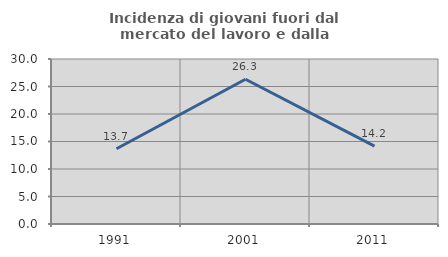
| Category | Incidenza di giovani fuori dal mercato del lavoro e dalla formazione  |
|---|---|
| 1991.0 | 13.675 |
| 2001.0 | 26.316 |
| 2011.0 | 14.151 |